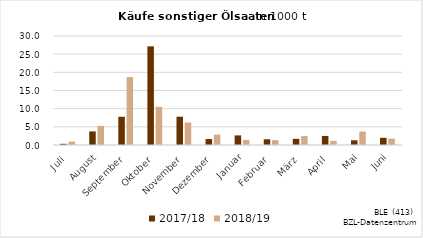
| Category | 2017/18 | 2018/19 |
|---|---|---|
| Juli | 0.327 | 0.926 |
| August | 3.747 | 5.257 |
| September | 7.771 | 18.679 |
| Oktober | 27.16 | 10.508 |
| November | 7.791 | 6.185 |
| Dezember | 1.641 | 2.854 |
| Januar | 2.643 | 1.413 |
| Februar | 1.579 | 1.33 |
| März | 1.693 | 2.45 |
| April | 2.492 | 1.141 |
| Mai | 1.296 | 3.709 |
| Juni | 1.978 | 1.746 |